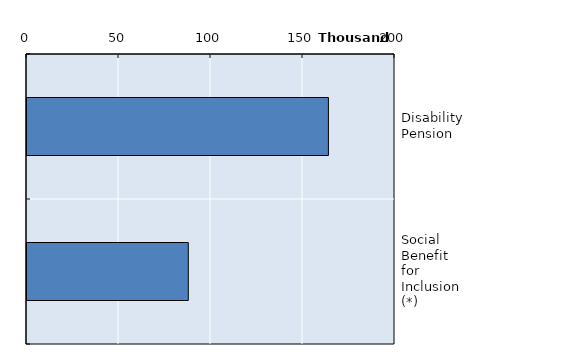
| Category | Series 0 |
|---|---|
| Disability Pension | 163815 |
| Social Benefit for Inclusion (*) | 87656 |